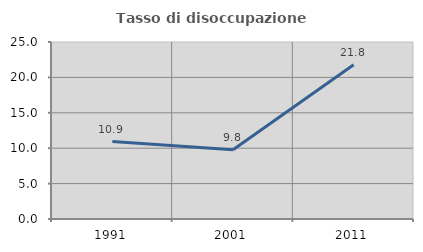
| Category | Tasso di disoccupazione giovanile  |
|---|---|
| 1991.0 | 10.938 |
| 2001.0 | 9.783 |
| 2011.0 | 21.795 |